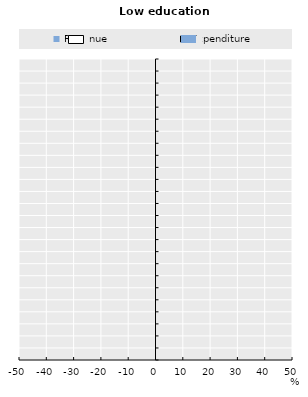
| Category | Revenue | Expenditure |
|---|---|---|
| FIN | -42.703 | 26.128 |
| BEL | -29.103 | 3.556 |
| LUX | -26.975 | 8.666 |
| SWE | -24.573 | 18.707 |
| ESP | -20.508 | -13.019 |
| DNK | -17.984 | 14.06 |
| USA | -15.863 | -3.311 |
| NLD | -15.157 | 15.233 |
| CZE | -14.919 | 12.835 |
| ITA | -14.875 | -7.015 |
| AUT | -14.724 | -3.541 |
| NOR | -13.28 | 12.581 |
| GBR | -9.88 | -5.371 |
| FRA | -9.544 | -7.544 |
| CAN | -8.983 | 4.689 |
| IRL | -8.512 | -0.049 |
| EST | -6.289 | -1.807 |
| GRC | -6.134 | -10.961 |
| AUS | -4.787 | -4.718 |
| LVA | -1.855 | 7.051 |
| SVN | 0.553 | 1.343 |
| CHE | 0.873 | -18.306 |
| PRT | 3.489 | -1.865 |
| DEU | 6.166 | -20.274 |
| LTU | 21.223 | 6.333 |